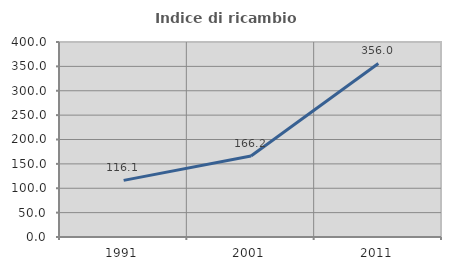
| Category | Indice di ricambio occupazionale  |
|---|---|
| 1991.0 | 116.119 |
| 2001.0 | 166.218 |
| 2011.0 | 356.033 |